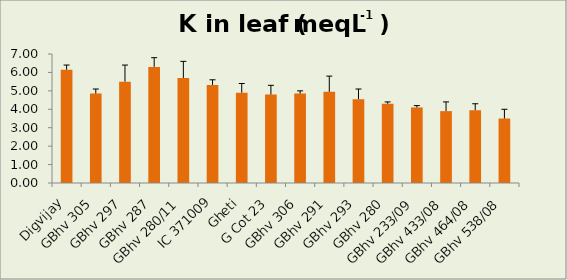
| Category | K in leaf (meqL-1 ) |
|---|---|
| Digvijay | 6.15 |
| GBhv 305 | 4.85 |
| GBhv 297 | 5.5 |
| GBhv 287 | 6.3 |
| GBhv 280/11 | 5.7 |
| IC 371009 | 5.32 |
| Gheti | 4.9 |
| G Cot 23 | 4.8 |
| GBhv 306 | 4.85 |
| GBhv 291 | 4.95 |
| GBhv 293 | 4.55 |
| GBhv 280 | 4.3 |
| GBhv 233/09 | 4.1 |
| GBhv 433/08 | 3.9 |
| GBhv 464/08 | 3.95 |
| GBhv 538/08 | 3.5 |